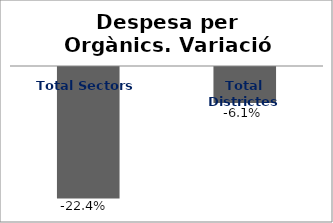
| Category | Series 0 |
|---|---|
| Total Sectors | -0.224 |
| Total Districtes | -0.061 |